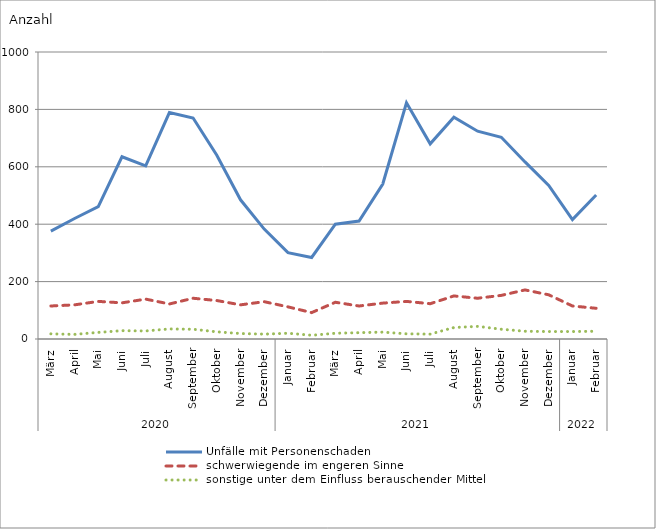
| Category | Unfälle mit Personenschaden | schwerwiegende im engeren Sinne | sonstige unter dem Einfluss berauschender Mittel |
|---|---|---|---|
| 0 | 376 | 115 | 18 |
| 1 | 420 | 119 | 16 |
| 2 | 461 | 131 | 23 |
| 3 | 635 | 126 | 29 |
| 4 | 603 | 139 | 28 |
| 5 | 789 | 122 | 35 |
| 6 | 770 | 142 | 34 |
| 7 | 640 | 134 | 25 |
| 8 | 485 | 119 | 19 |
| 9 | 383 | 130 | 17 |
| 10 | 301 | 112 | 20 |
| 11 | 284 | 92 | 13 |
| 12 | 400 | 128 | 20 |
| 13 | 411 | 115 | 22 |
| 14 | 540 | 125 | 24 |
| 15 | 823 | 131 | 18 |
| 16 | 680 | 123 | 17 |
| 17 | 773 | 150 | 40 |
| 18 | 724 | 142 | 44 |
| 19 | 703 | 152 | 34 |
| 20 | 617 | 171 | 27 |
| 21 | 535 | 154 | 26 |
| 22 | 416 | 115 | 26 |
| 23 | 502 | 107 | 27 |